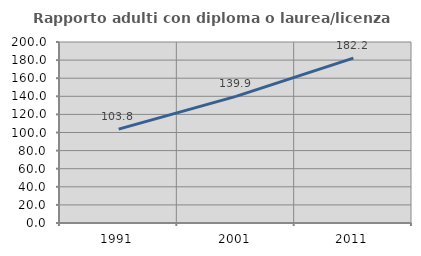
| Category | Rapporto adulti con diploma o laurea/licenza media  |
|---|---|
| 1991.0 | 103.774 |
| 2001.0 | 139.918 |
| 2011.0 | 182.244 |